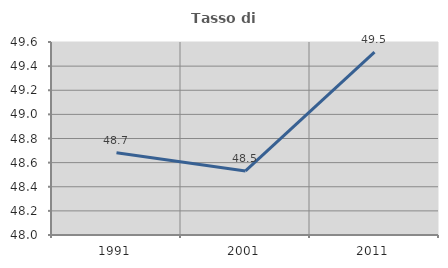
| Category | Tasso di occupazione   |
|---|---|
| 1991.0 | 48.681 |
| 2001.0 | 48.531 |
| 2011.0 | 49.516 |